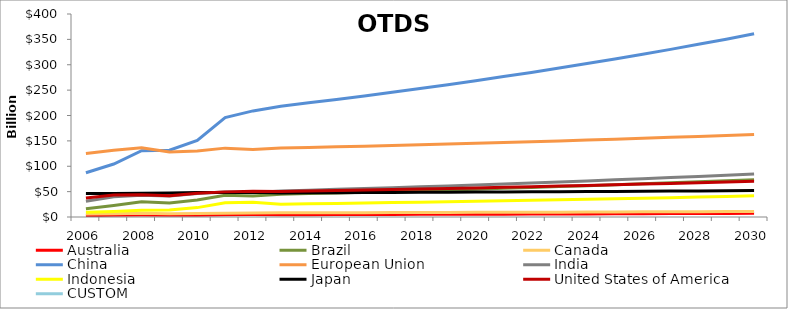
| Category | Australia | Brazil | Canada | China | European Union | India | Indonesia | Japan | United States of America | CUSTOM |
|---|---|---|---|---|---|---|---|---|---|---|
| 2006.0 | 2639596400.131 | 16341193150 | 5782343191.102 | 87233609600 | 125135495795.588 | 31111702000 | 9216450000 | 46384205111.953 | 37275354000 |  |
| 2007.0 | 3247875400.131 | 22710165150 | 6260005191.102 | 104454619800 | 131395538795.588 | 39926360000 | 10985478000 | 46139829111.953 | 43507358000 |  |
| 2008.0 | 3913574400.131 | 30060091150 | 7268794191.102 | 130685985300 | 136316061795.588 | 43012342000 | 13481302000 | 46988349111.953 | 44029063000 |  |
| 2009.0 | 3419759400.131 | 27610459150 | 6649163191.102 | 131736575100 | 128273123795.588 | 41379604000 | 13559770000 | 47470963111.953 | 41804075000 |  |
| 2010.0 | 3616436400.131 | 33421571150 | 6687609191.102 | 150826621400 | 129824164795.588 | 46126178000 | 18491138000 | 48067160111.953 | 46696855000 |  |
| 2011.0 | 4585201400.131 | 42755149150 | 7326502191.102 | 195952575700 | 135701684795.588 | 49472700000 | 28223174000 | 48491804111.953 | 49508893000 |  |
| 2012.0 | 4710807400.131 | 41364295150 | 7798103191.102 | 209051862800 | 133145876795.588 | 47734470000 | 28859560000 | 48991799111.953 | 50668008000 |  |
| 2013.0 | 4550855400.131 | 44792417150 | 8182085191.102 | 218381903100 | 135721475795.588 | 51356354000 | 25209368000 | 47412534111.953 | 50208429000 |  |
| 2014.0 | 4673937690.131 | 46108826510 | 8305422031.102 | 224933360193 | 136961809085.588 | 52897044620 | 25965649040 | 47625976401.953 | 51141681870 |  |
| 2015.0 | 4800712448.831 | 47464728150.8 | 8432458976.302 | 231681360998.79 | 138239352374.288 | 54483955958.6 | 26744618511.2 | 47845821960.653 | 52102932326.1 |  |
| 2016.0 | 4931290450.292 | 48861306840.824 | 8563307029.858 | 238631801828.754 | 139555221961.649 | 56118474637.358 | 27546957066.536 | 48072262886.114 | 53093020295.883 |  |
| 2017.0 | 5065785791.797 | 50299782891.549 | 8698080525.02 | 245790755883.616 | 140910567636.631 | 57802028876.479 | 28373365778.532 | 48305497039.339 | 54112810904.759 |  |
| 2018.0 | 5204315993.547 | 51781413223.795 | 8836897225.038 | 253164478560.125 | 142306573681.862 | 59536089742.773 | 29224566751.888 | 48545728217.161 | 55163195231.902 |  |
| 2019.0 | 5347002101.35 | 53307492466.009 | 8979878426.056 | 260759412916.929 | 143744459908.45 | 61322172435.056 | 30101303754.445 | 48793166330.317 | 56245091088.859 |  |
| 2020.0 | 5493968792.386 | 54879354085.489 | 9127149063.105 | 268582195304.436 | 145225482721.836 | 63161837608.108 | 31004342867.078 | 49048027586.868 | 57359443821.525 |  |
| 2021.0 | 5645344484.154 | 56498371553.554 | 9278837819.265 | 276639661163.57 | 146750936219.624 | 65056692736.351 | 31934473153.09 | 49310534681.115 | 58507227136.171 |  |
| 2022.0 | 5801261446.674 | 58165959545.661 | 9435077238.11 | 284938850998.477 | 148322153322.345 | 67008393518.442 | 32892507347.683 | 49580916988.19 | 59689443950.256 |  |
| 2023.0 | 5961855918.071 | 59883575177.53 | 9596003839.52 | 293487016528.431 | 149940506938.147 | 69018645323.995 | 33879282568.114 | 49859410764.477 | 60907127268.764 |  |
| 2024.0 | 6127268223.609 | 61652719278.356 | 9761758238.973 | 302291627024.284 | 151607411162.424 | 71089204683.715 | 34895661045.157 | 50146259354.053 | 62161341086.827 |  |
| 2025.0 | 6297642898.313 | 63474937702.207 | 9932485270.409 | 311360375835.012 | 153324322513.429 | 73221880824.226 | 35942530876.512 | 50441713401.316 | 63453181319.431 |  |
| 2026.0 | 6473128813.259 | 65351822678.773 | 10108334112.788 | 320701187110.063 | 155092741204.965 | 75418537248.953 | 37020806802.807 | 50746031069.997 | 64783776759.014 |  |
| 2027.0 | 6653879305.652 | 67285014204.636 | 10289458420.438 | 330322222723.365 | 156914212457.246 | 77681093366.422 | 38131431006.891 | 51059478268.738 | 66154290061.785 |  |
| 2028.0 | 6840052312.818 | 69276201476.276 | 10476016457.319 | 340231889405.066 | 158790327847.096 | 80011526167.414 | 39275373937.098 | 51382328883.442 | 67565918763.638 |  |
| 2029.0 | 7031810510.199 | 71327124366.064 | 10668171235.305 | 350438846087.218 | 160722726698.641 | 82411871952.437 | 40453635155.211 | 51714865016.586 | 69019896326.547 |  |
| 2030.0 | 7229321453.501 | 73439574942.546 | 10866090656.631 | 360952011469.834 | 162713097515.732 | 84884228111.01 | 41667244209.867 | 52057377233.725 | 70517493216.344 |  |